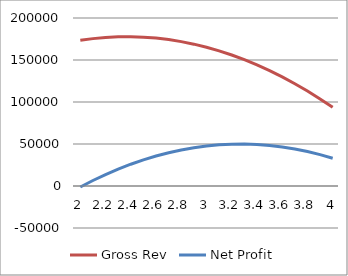
| Category | Gross Rev | Net Profit |
|---|---|---|
| 2.0 | 173417.722 | -1158.228 |
| 2.1 | 175443.038 | 6563.291 |
| 2.2 | 176835.443 | 13651.899 |
| 2.3 | 177594.937 | 20107.595 |
| 2.4 | 177721.519 | 25930.38 |
| 2.5 | 177215.19 | 31120.253 |
| 2.6 | 176075.949 | 35677.215 |
| 2.7 | 174303.797 | 39601.266 |
| 2.8 | 171898.734 | 42892.405 |
| 2.9 | 168860.759 | 45550.633 |
| 3.0 | 165189.873 | 47575.949 |
| 3.1 | 160886.076 | 48968.354 |
| 3.2 | 155949.367 | 49727.848 |
| 3.3 | 150379.747 | 49854.43 |
| 3.4 | 144177.215 | 49348.101 |
| 3.5 | 137341.772 | 48208.861 |
| 3.6 | 129873.418 | 46436.709 |
| 3.7 | 121772.152 | 44031.646 |
| 3.8 | 113037.975 | 40993.671 |
| 3.9 | 103670.886 | 37322.785 |
| 4.0 | 93670.886 | 33018.987 |